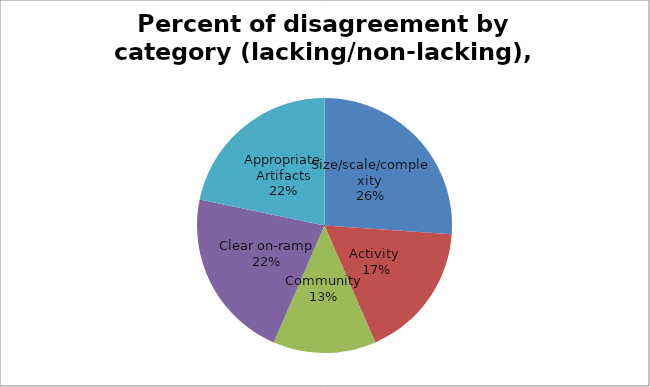
| Category | Percent of disagreement by category (lacking/non-lacking), mission critical |
|---|---|
| Size/scale/complexity  | 6 |
| Activity  | 4 |
| Community | 3 |
| Clear on-ramp | 5 |
| Appropriate Artifacts | 5 |